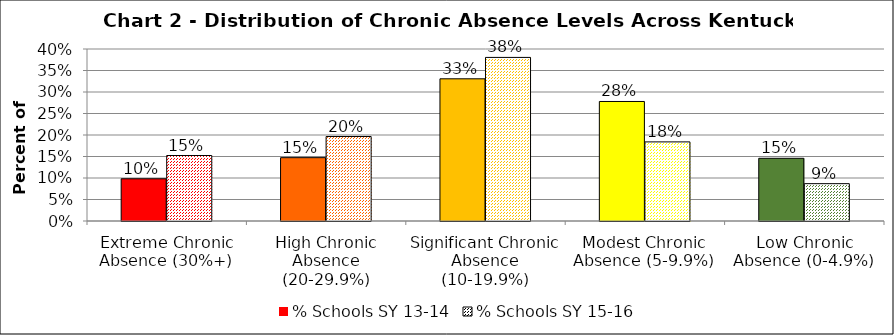
| Category | % Schools SY 13-14 | % Schools SY 15-16 |
|---|---|---|
| Extreme Chronic Absence (30%+) | 0.098 | 0.152 |
| High Chronic Absence (20-29.9%) | 0.147 | 0.196 |
| Significant Chronic Absence (10-19.9%) | 0.331 | 0.38 |
| Modest Chronic Absence (5-9.9%) | 0.278 | 0.184 |
| Low Chronic Absence (0-4.9%) | 0.146 | 0.087 |